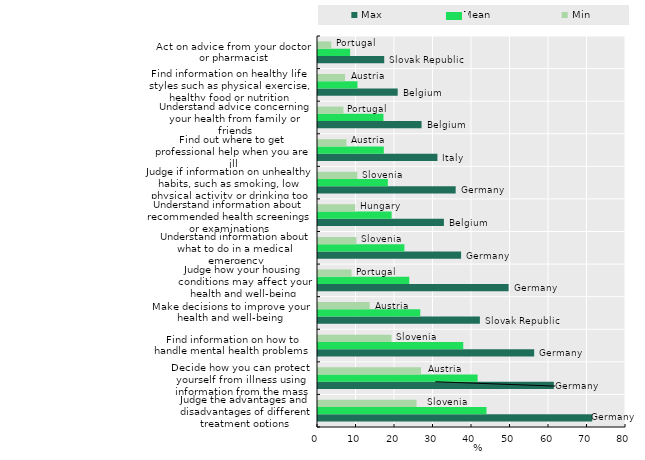
| Category | Max | Mean | Min |
|---|---|---|---|
| Judge the advantages and disadvantages of different treatment options | 71.23 | 43.767 | 25.6 |
| Decide how you can protect yourself from illness using information from the mass media | 61.25 | 41.459 | 26.75 |
| Find information on how to handle mental health problems | 56.15 | 37.729 | 19.09 |
| Make decisions to improve your health and well-being | 42.05 | 26.561 | 13.42 |
| Judge how your housing conditions may affect your health and well-being | 49.51 | 23.713 | 8.7 |
| Understand information about what to do in a medical emergency | 37.17 | 22.439 | 9.98 |
| Understand information about recommended health screenings or examinations | 32.7 | 19.119 | 9.68 |
| Judge if information on unhealthy habits, such as smoking, low physical activity or drinking too much alcohol, are reliable | 35.76 | 18.14 | 10.23 |
| Find out where to get professional help when you are ill | 31.02 | 17.097 | 7.39 |
| Understand advice concerning your health from family or friends | 26.9 | 17.007 | 6.61 |
| Find information on healthy life styles such as physical exercise, healthy food or nutrition | 20.7 | 10.252 | 7.02 |
| Act on advice from your doctor or pharmacist | 17.2 | 8.343 | 3.45 |